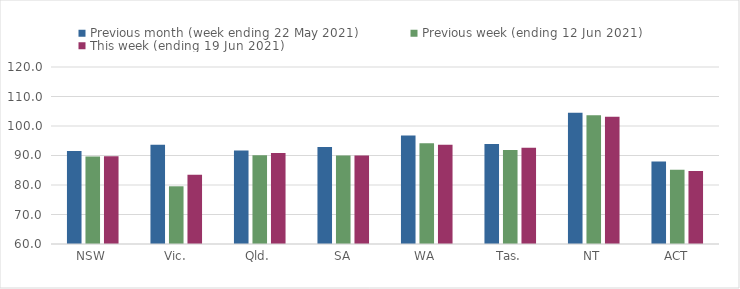
| Category | Previous month (week ending 22 May 2021) | Previous week (ending 12 Jun 2021) | This week (ending 19 Jun 2021) |
|---|---|---|---|
| NSW | 91.53 | 89.64 | 89.75 |
| Vic. | 93.62 | 79.56 | 83.48 |
| Qld. | 91.73 | 90.07 | 90.83 |
| SA | 92.92 | 89.97 | 89.97 |
| WA | 96.74 | 94.17 | 93.67 |
| Tas. | 93.91 | 91.88 | 92.65 |
| NT | 104.48 | 103.61 | 103.17 |
| ACT | 87.96 | 85.2 | 84.75 |